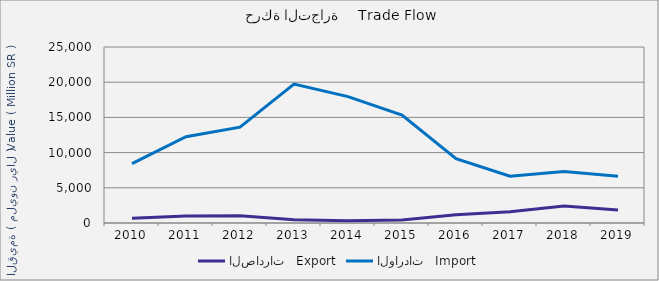
| Category | الصادرات   Export | الواردات   Import |
|---|---|---|
| 2010.0 | 675342787 | 8437497461 |
| 2011.0 | 982486532 | 12263537558 |
| 2012.0 | 1046805541 | 13620325970 |
| 2013.0 | 467488414 | 19739585467 |
| 2014.0 | 332025650 | 17952876578 |
| 2015.0 | 423830081 | 15316076450 |
| 2016.0 | 1181915519 | 9144531694 |
| 2017.0 | 1605620620 | 6643713068 |
| 2018.0 | 2398921967 | 7329262169 |
| 2019.0 | 1840483078 | 6640883824 |